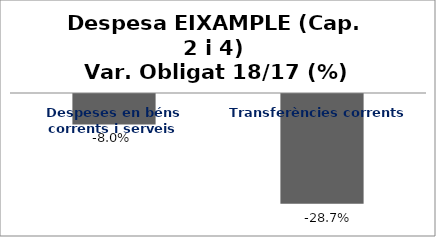
| Category | Series 0 |
|---|---|
| Despeses en béns corrents i serveis | -0.08 |
| Transferències corrents | -0.287 |